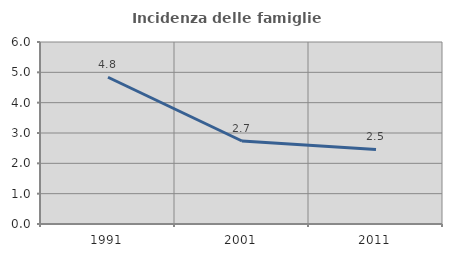
| Category | Incidenza delle famiglie numerose |
|---|---|
| 1991.0 | 4.838 |
| 2001.0 | 2.737 |
| 2011.0 | 2.457 |